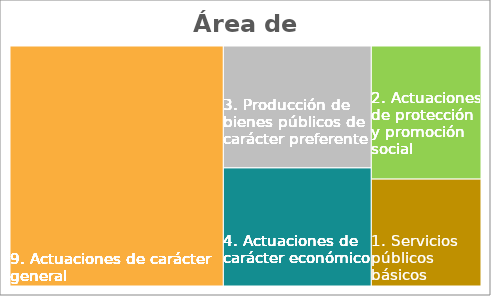
| Category | Series 0 |
|---|---|
| 60. Inv. nueva en infraestruc. y bienes para uso general. | 0.076 |
| 61. Inv. de reposición infraest. y bienes uso gral. | 0.547 |
| 62. Inv.nueva asociada al funcionam. operativo serv. | 0.048 |
| 63. Inv. reposición assoc. funcionamiento operativo serv. | 0.174 |
| 64. Gastos en inversiones de carácter immaterial | 0.079 |
| 65. Gastos inv. gestionadas por otros entes púbicos | 0.07 |
| 68. Gastos en inversiones de bienes patrimoniales  | 0.006 |